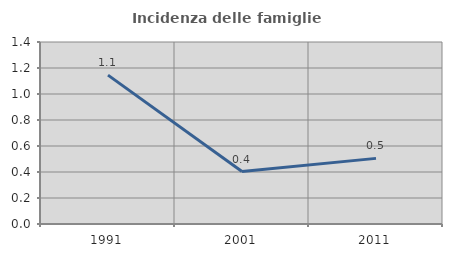
| Category | Incidenza delle famiglie numerose |
|---|---|
| 1991.0 | 1.145 |
| 2001.0 | 0.404 |
| 2011.0 | 0.505 |